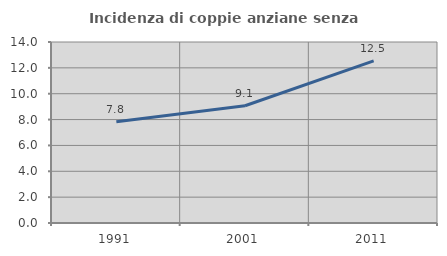
| Category | Incidenza di coppie anziane senza figli  |
|---|---|
| 1991.0 | 7.835 |
| 2001.0 | 9.069 |
| 2011.0 | 12.538 |